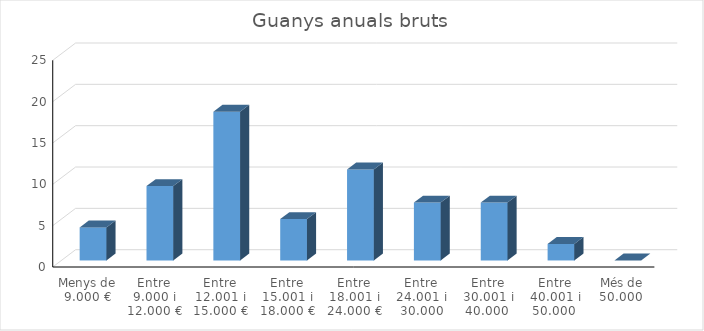
| Category | Series 0 |
|---|---|
| Menys de 9.000 € | 4 |
| Entre 9.000 i 12.000 € | 9 |
| Entre 12.001 i 15.000 € | 18 |
| Entre 15.001 i 18.000 € | 5 |
| Entre 18.001 i 24.000 € | 11 |
| Entre 24.001 i 30.000 | 7 |
| Entre 30.001 i 40.000  | 7 |
| Entre 40.001 i 50.000  | 2 |
| Més de 50.000  | 0 |